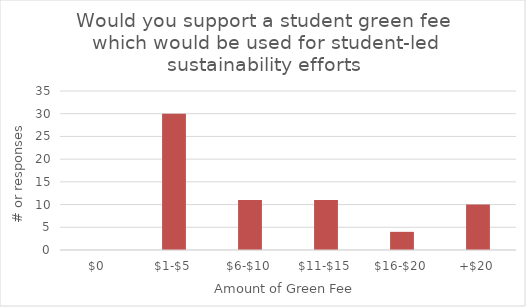
| Category | Series 1 |
|---|---|
| $0 | 0 |
| $1-$5 | 30 |
| $6-$10 | 11 |
| $11-$15 | 11 |
| $16-$20 | 4 |
| +$20 | 10 |